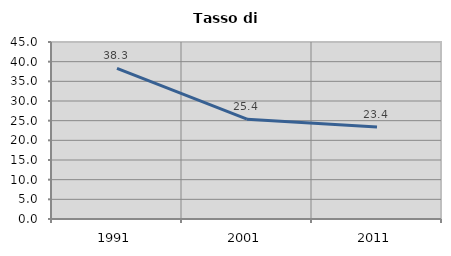
| Category | Tasso di disoccupazione   |
|---|---|
| 1991.0 | 38.28 |
| 2001.0 | 25.366 |
| 2011.0 | 23.4 |